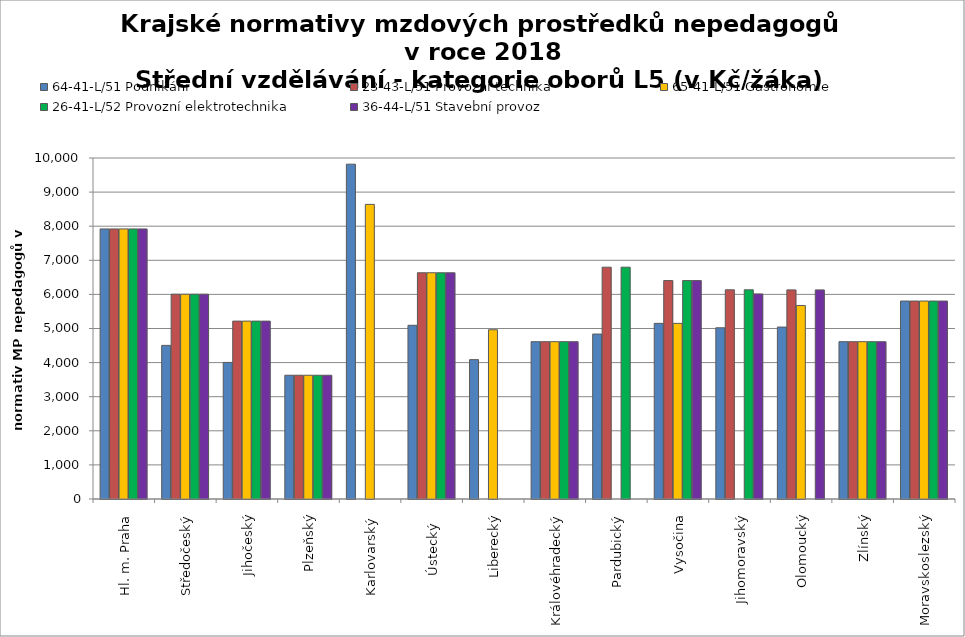
| Category | 64-41-L/51 Podnikání | 23-43-L/51 Provozní technika | 65-41-L/51 Gastronomie | 26-41-L/52 Provozní elektrotechnika | 36-44-L/51 Stavební provoz |
|---|---|---|---|---|---|
| Hl. m. Praha | 7920 | 7920 | 7920 | 7920 | 7920 |
| Středočeský | 4504.714 | 6006.286 | 6006.286 | 6006.286 | 6006.286 |
| Jihočeský | 4004.972 | 5216.432 | 5216.535 | 5216.432 | 5216.432 |
| Plzeňský | 3629.455 | 3629.455 | 3629.455 | 3629.455 | 3629.455 |
| Karlovarský  | 9818.182 | 0 | 8640 | 0 | 0 |
| Ústecký   | 5093.895 | 6634.612 | 6634.612 | 6634.612 | 6634.612 |
| Liberecký | 4086.831 | 0 | 4962.902 | 0 | 0 |
| Královéhradecký | 4613.36 | 4613.36 | 4613.36 | 4613.36 | 4613.36 |
| Pardubický | 4837.154 | 6798.162 | 0 | 6798.162 | 0 |
| Vysočina | 5150.507 | 6404.933 | 5150.507 | 6404.933 | 6404.933 |
| Jihomoravský | 5021.174 | 6134.516 | 0 | 6134.516 | 6014.493 |
| Olomoucký | 5042.494 | 6132.616 | 5673.433 | 0 | 6132.616 |
| Zlínský | 4613.52 | 4613.52 | 4613.52 | 4613.52 | 4613.52 |
| Moravskoslezský | 5805.381 | 5805.381 | 5805.381 | 5805.381 | 5805.381 |